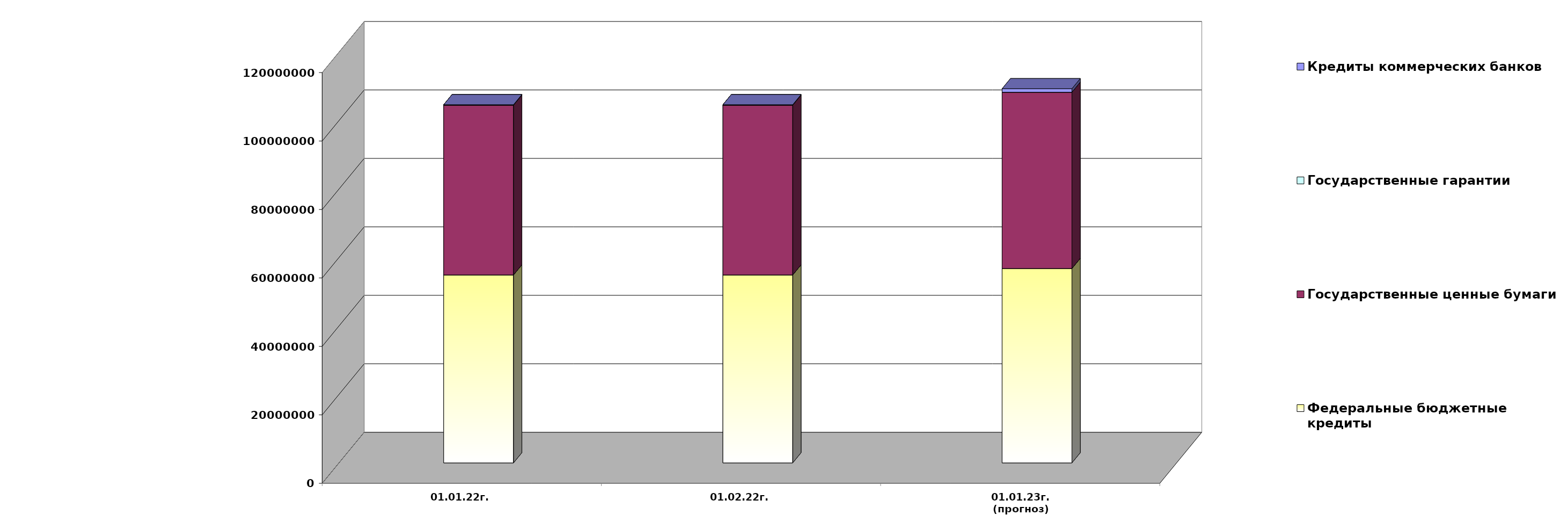
| Category | Федеральные бюджетные кредиты | Государственные ценные бумаги  | Государственные гарантии | Кредиты коммерческих банков |
|---|---|---|---|---|
| 01.01.22г. | 54900618.713 | 49600000 | 141570.67 | 0 |
| 01.02.22г. | 54900618.713 | 49600000 | 139748.87 | 0 |
| 01.01.23г.
(прогноз) | 56784668.3 | 51500000 | 0 | 1032389.5 |